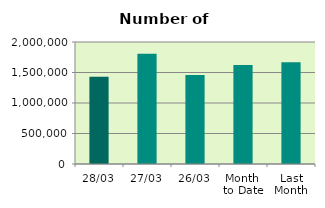
| Category | Series 0 |
|---|---|
| 28/03 | 1432326 |
| 27/03 | 1808906 |
| 26/03 | 1459676 |
| Month 
to Date | 1622538.1 |
| Last
Month | 1666801.1 |